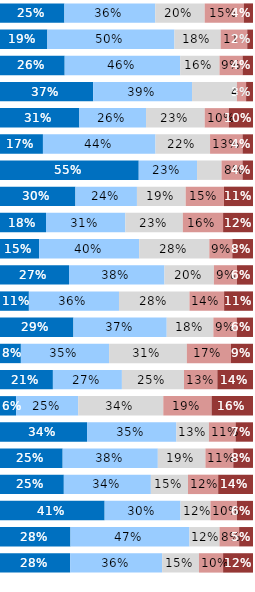
| Category | Almost Always or Always | Usually | Occasionally | Seldom | Never or Almost Never |
|---|---|---|---|---|---|
| Q1 | 0.255 | 0.359 | 0.195 | 0.155 | 0.036 |
| Q2 | 0.187 | 0.502 | 0.183 | 0.105 | 0.023 |
| Q3 | 0.256 | 0.457 | 0.155 | 0.091 | 0.041 |
| Q4 | 0.368 | 0.391 | 0.177 | 0.036 | 0.027 |
| Q5 | 0.314 | 0.264 | 0.232 | 0.095 | 0.095 |
| Q6 | 0.17 | 0.445 | 0.216 | 0.128 | 0.041 |
| Q7 | 0.548 | 0.23 | 0.097 | 0.083 | 0.041 |
| Q8 | 0.298 | 0.243 | 0.193 | 0.151 | 0.115 |
| Q9 | 0.182 | 0.314 | 0.227 | 0.159 | 0.118 |
| Q10 | 0.155 | 0.395 | 0.277 | 0.091 | 0.082 |
| Q11 | 0.273 | 0.377 | 0.195 | 0.091 | 0.064 |
| Q12 | 0.114 | 0.356 | 0.279 | 0.137 | 0.114 |
| Q13 | 0.29 | 0.369 | 0.184 | 0.092 | 0.065 |
| Q14 | 0.083 | 0.349 | 0.307 | 0.174 | 0.087 |
| Q15 | 0.209 | 0.273 | 0.245 | 0.132 | 0.141 |
| Q16 | 0.064 | 0.245 | 0.336 | 0.191 | 0.164 |
| Q17 | 0.344 | 0.353 | 0.128 | 0.106 | 0.069 |
| Q18 | 0.248 | 0.376 | 0.188 | 0.11 | 0.078 |
| Q19 | 0.252 | 0.344 | 0.147 | 0.119 | 0.138 |
| Q20 | 0.414 | 0.3 | 0.118 | 0.105 | 0.064 |
| Q21 | 0.279 | 0.47 | 0.119 | 0.078 | 0.055 |
| Q22 | 0.277 | 0.364 | 0.145 | 0.095 | 0.118 |